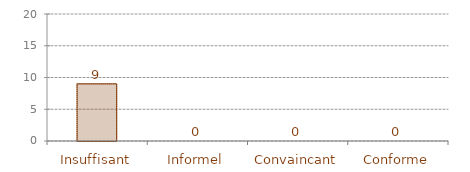
| Category | Conformités | moyenne |
|---|---|---|
| Insuffisant | 9 | 9 |
| Informel | 0 | 0 |
| Convaincant | 0 | 0 |
| Conforme | 0 | 0 |